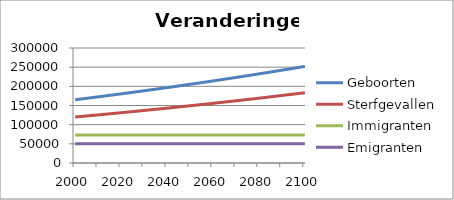
| Category | Geboorten | Sterfgevallen | Immigranten | Emigranten |
|---|---|---|---|---|
| 2000.0 | 165000 | 120000 | 73000 | 50000 |
| 2001.0 | 165748 | 120544 | 73000 | 50000 |
| 2002.0 | 166498.244 | 121089.632 | 73000 | 50000 |
| 2003.0 | 167250.739 | 121636.901 | 73000 | 50000 |
| 2004.0 | 168005.491 | 122185.812 | 73000 | 50000 |
| 2005.0 | 168762.507 | 122736.369 | 73000 | 50000 |
| 2006.0 | 169521.795 | 123288.578 | 73000 | 50000 |
| 2007.0 | 170283.36 | 123842.444 | 73000 | 50000 |
| 2008.0 | 171047.21 | 124397.971 | 73000 | 50000 |
| 2009.0 | 171813.352 | 124955.165 | 73000 | 50000 |
| 2010.0 | 172581.792 | 125514.031 | 73000 | 50000 |
| 2011.0 | 173352.537 | 126074.573 | 73000 | 50000 |
| 2012.0 | 174125.595 | 126636.796 | 73000 | 50000 |
| 2013.0 | 174900.972 | 127200.707 | 73000 | 50000 |
| 2014.0 | 175678.675 | 127766.309 | 73000 | 50000 |
| 2015.0 | 176458.711 | 128333.608 | 73000 | 50000 |
| 2016.0 | 177241.087 | 128902.609 | 73000 | 50000 |
| 2017.0 | 178025.81 | 129473.317 | 73000 | 50000 |
| 2018.0 | 178812.888 | 130045.736 | 73000 | 50000 |
| 2019.0 | 179602.326 | 130619.874 | 73000 | 50000 |
| 2020.0 | 180394.133 | 131195.733 | 73000 | 50000 |
| 2021.0 | 181188.316 | 131773.32 | 73000 | 50000 |
| 2022.0 | 181984.881 | 132352.64 | 73000 | 50000 |
| 2023.0 | 182783.835 | 132933.698 | 73000 | 50000 |
| 2024.0 | 183585.187 | 133516.499 | 73000 | 50000 |
| 2025.0 | 184388.942 | 134101.049 | 73000 | 50000 |
| 2026.0 | 185195.109 | 134687.352 | 73000 | 50000 |
| 2027.0 | 186003.694 | 135275.414 | 73000 | 50000 |
| 2028.0 | 186814.706 | 135865.24 | 73000 | 50000 |
| 2029.0 | 187628.15 | 136456.836 | 73000 | 50000 |
| 2030.0 | 188444.034 | 137050.207 | 73000 | 50000 |
| 2031.0 | 189262.366 | 137645.357 | 73000 | 50000 |
| 2032.0 | 190083.153 | 138242.293 | 73000 | 50000 |
| 2033.0 | 190906.403 | 138841.02 | 73000 | 50000 |
| 2034.0 | 191732.122 | 139441.543 | 73000 | 50000 |
| 2035.0 | 192560.318 | 140043.868 | 73000 | 50000 |
| 2036.0 | 193390.999 | 140648 | 73000 | 50000 |
| 2037.0 | 194224.172 | 141253.944 | 73000 | 50000 |
| 2038.0 | 195059.845 | 141861.705 | 73000 | 50000 |
| 2039.0 | 195898.024 | 142471.29 | 73000 | 50000 |
| 2040.0 | 196738.718 | 143082.704 | 73000 | 50000 |
| 2041.0 | 197581.935 | 143695.952 | 73000 | 50000 |
| 2042.0 | 198427.68 | 144311.04 | 73000 | 50000 |
| 2043.0 | 199275.963 | 144927.973 | 73000 | 50000 |
| 2044.0 | 200126.791 | 145546.757 | 73000 | 50000 |
| 2045.0 | 200980.172 | 146167.398 | 73000 | 50000 |
| 2046.0 | 201836.112 | 146789.9 | 73000 | 50000 |
| 2047.0 | 202694.621 | 147414.27 | 73000 | 50000 |
| 2048.0 | 203555.704 | 148040.512 | 73000 | 50000 |
| 2049.0 | 204419.372 | 148668.634 | 73000 | 50000 |
| 2050.0 | 205285.63 | 149298.64 | 73000 | 50000 |
| 2051.0 | 206154.487 | 149930.536 | 73000 | 50000 |
| 2052.0 | 207025.95 | 150564.327 | 73000 | 50000 |
| 2053.0 | 207900.028 | 151200.02 | 73000 | 50000 |
| 2054.0 | 208776.728 | 151837.62 | 73000 | 50000 |
| 2055.0 | 209656.058 | 152477.133 | 73000 | 50000 |
| 2056.0 | 210538.026 | 153118.565 | 73000 | 50000 |
| 2057.0 | 211422.64 | 153761.92 | 73000 | 50000 |
| 2058.0 | 212309.908 | 154407.206 | 73000 | 50000 |
| 2059.0 | 213199.838 | 155054.428 | 73000 | 50000 |
| 2060.0 | 214092.438 | 155703.591 | 73000 | 50000 |
| 2061.0 | 214987.715 | 156354.702 | 73000 | 50000 |
| 2062.0 | 215885.678 | 157007.766 | 73000 | 50000 |
| 2063.0 | 216786.335 | 157662.789 | 73000 | 50000 |
| 2064.0 | 217689.694 | 158319.777 | 73000 | 50000 |
| 2065.0 | 218595.763 | 158978.737 | 73000 | 50000 |
| 2066.0 | 219504.55 | 159639.673 | 73000 | 50000 |
| 2067.0 | 220416.064 | 160302.592 | 73000 | 50000 |
| 2068.0 | 221330.312 | 160967.5 | 73000 | 50000 |
| 2069.0 | 222247.303 | 161634.402 | 73000 | 50000 |
| 2070.0 | 223167.045 | 162303.306 | 73000 | 50000 |
| 2071.0 | 224089.546 | 162974.215 | 73000 | 50000 |
| 2072.0 | 225014.815 | 163647.138 | 73000 | 50000 |
| 2073.0 | 225942.859 | 164322.079 | 73000 | 50000 |
| 2074.0 | 226873.688 | 164999.046 | 73000 | 50000 |
| 2075.0 | 227807.309 | 165678.043 | 73000 | 50000 |
| 2076.0 | 228743.731 | 166359.077 | 73000 | 50000 |
| 2077.0 | 229682.962 | 167042.154 | 73000 | 50000 |
| 2078.0 | 230625.011 | 167727.281 | 73000 | 50000 |
| 2079.0 | 231569.886 | 168414.463 | 73000 | 50000 |
| 2080.0 | 232517.596 | 169103.706 | 73000 | 50000 |
| 2081.0 | 233468.148 | 169795.017 | 73000 | 50000 |
| 2082.0 | 234421.553 | 170488.402 | 73000 | 50000 |
| 2083.0 | 235377.818 | 171183.867 | 73000 | 50000 |
| 2084.0 | 236336.951 | 171881.419 | 73000 | 50000 |
| 2085.0 | 237298.962 | 172581.063 | 73000 | 50000 |
| 2086.0 | 238263.859 | 173282.806 | 73000 | 50000 |
| 2087.0 | 239231.65 | 173986.655 | 73000 | 50000 |
| 2088.0 | 240202.345 | 174692.615 | 73000 | 50000 |
| 2089.0 | 241175.952 | 175400.693 | 73000 | 50000 |
| 2090.0 | 242152.48 | 176110.895 | 73000 | 50000 |
| 2091.0 | 243131.938 | 176823.227 | 73000 | 50000 |
| 2092.0 | 244114.333 | 177537.697 | 73000 | 50000 |
| 2093.0 | 245099.676 | 178254.31 | 73000 | 50000 |
| 2094.0 | 246087.975 | 178973.073 | 73000 | 50000 |
| 2095.0 | 247079.239 | 179693.992 | 73000 | 50000 |
| 2096.0 | 248073.477 | 180417.074 | 73000 | 50000 |
| 2097.0 | 249070.698 | 181142.325 | 73000 | 50000 |
| 2098.0 | 250070.91 | 181869.752 | 73000 | 50000 |
| 2099.0 | 251074.122 | 182599.362 | 73000 | 50000 |
| 2100.0 | 252080.345 | 183331.16 | 73000 | 50000 |